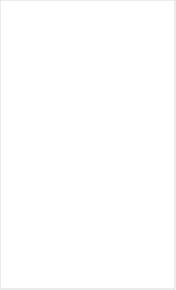
| Category | Max Funded | Min Funded | Median Funded | Mean Funded |
|---|---|---|---|---|
| Total | 489972 | 38000 | 143015.5 | 205684.858 |